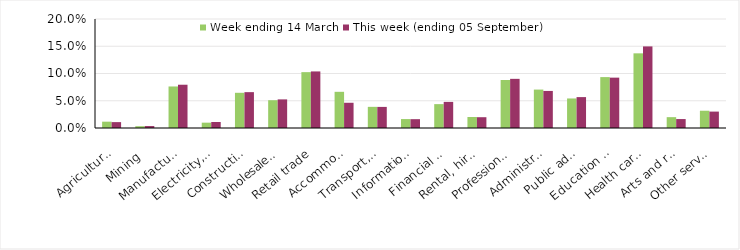
| Category | Week ending 14 March | This week (ending 05 September) |
|---|---|---|
| Agriculture, forestry and fishing | 0.012 | 0.011 |
| Mining | 0.003 | 0.004 |
| Manufacturing | 0.076 | 0.079 |
| Electricity, gas, water and waste services | 0.01 | 0.011 |
| Construction | 0.065 | 0.066 |
| Wholesale trade | 0.051 | 0.052 |
| Retail trade | 0.102 | 0.104 |
| Accommodation and food services | 0.066 | 0.046 |
| Transport, postal and warehousing | 0.039 | 0.039 |
| Information media and telecommunications | 0.016 | 0.016 |
| Financial and insurance services | 0.044 | 0.048 |
| Rental, hiring and real estate services | 0.02 | 0.02 |
| Professional, scientific and technical services | 0.088 | 0.09 |
| Administrative and support services | 0.07 | 0.068 |
| Public administration and safety | 0.054 | 0.057 |
| Education and training | 0.093 | 0.092 |
| Health care and social assistance | 0.137 | 0.15 |
| Arts and recreation services | 0.02 | 0.016 |
| Other services | 0.032 | 0.03 |